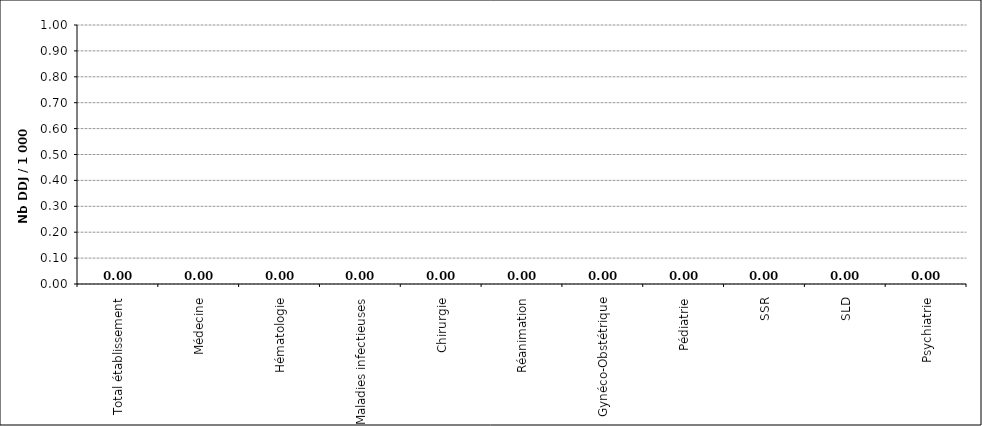
| Category | DDJ / 1000 JH |
|---|---|
| Total établissement | 0 |
| Médecine | 0 |
| Hématologie | 0 |
| Maladies infectieuses | 0 |
| Chirurgie | 0 |
| Réanimation | 0 |
| Gynéco-Obstétrique | 0 |
| Pédiatrie | 0 |
| SSR | 0 |
| SLD | 0 |
| Psychiatrie | 0 |